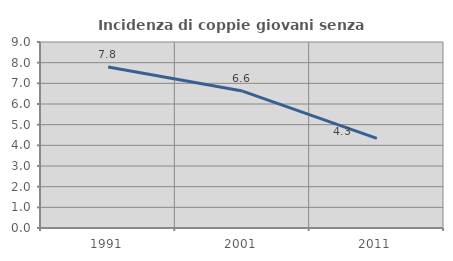
| Category | Incidenza di coppie giovani senza figli |
|---|---|
| 1991.0 | 7.789 |
| 2001.0 | 6.626 |
| 2011.0 | 4.334 |